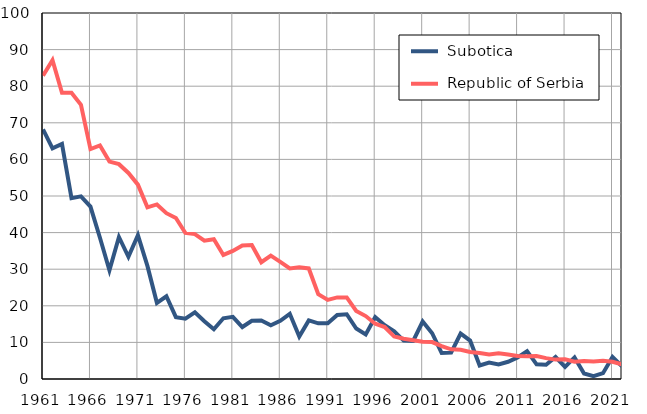
| Category |  Subotica |  Republic of Serbia |
|---|---|---|
| 1961.0 | 68.2 | 82.9 |
| 1962.0 | 63 | 87.1 |
| 1963.0 | 64.2 | 78.2 |
| 1964.0 | 49.4 | 78.2 |
| 1965.0 | 49.9 | 74.9 |
| 1966.0 | 47.1 | 62.8 |
| 1967.0 | 38.6 | 63.8 |
| 1968.0 | 29.7 | 59.4 |
| 1969.0 | 38.8 | 58.7 |
| 1970.0 | 33.4 | 56.3 |
| 1971.0 | 39.3 | 53.1 |
| 1972.0 | 30.9 | 46.9 |
| 1973.0 | 20.8 | 47.7 |
| 1974.0 | 22.6 | 45.3 |
| 1975.0 | 16.9 | 44 |
| 1976.0 | 16.5 | 39.9 |
| 1977.0 | 18.2 | 39.6 |
| 1978.0 | 15.8 | 37.8 |
| 1979.0 | 13.6 | 38.2 |
| 1980.0 | 16.6 | 33.9 |
| 1981.0 | 17 | 35 |
| 1982.0 | 14.2 | 36.5 |
| 1983.0 | 15.9 | 36.6 |
| 1984.0 | 16 | 31.9 |
| 1985.0 | 14.7 | 33.7 |
| 1986.0 | 15.9 | 32 |
| 1987.0 | 17.8 | 30.2 |
| 1988.0 | 11.6 | 30.5 |
| 1989.0 | 16 | 30.2 |
| 1990.0 | 15.2 | 23.2 |
| 1991.0 | 15.2 | 21.6 |
| 1992.0 | 17.5 | 22.3 |
| 1993.0 | 17.7 | 22.3 |
| 1994.0 | 13.8 | 18.6 |
| 1995.0 | 12.2 | 17.2 |
| 1996.0 | 16.9 | 15.1 |
| 1997.0 | 14.7 | 14.2 |
| 1998.0 | 13 | 11.6 |
| 1999.0 | 10.5 | 11 |
| 2000.0 | 10.4 | 10.6 |
| 2001.0 | 15.7 | 10.2 |
| 2002.0 | 12.5 | 10.1 |
| 2003.0 | 7.1 | 9 |
| 2004.0 | 7.2 | 8.1 |
| 2005.0 | 12.4 | 8 |
| 2006.0 | 10.5 | 7.4 |
| 2007.0 | 3.7 | 7.1 |
| 2008.0 | 4.5 | 6.7 |
| 2009.0 | 4 | 7 |
| 2010.0 | 4.7 | 6.7 |
| 2011.0 | 5.9 | 6.3 |
| 2012.0 | 7.6 | 6.2 |
| 2013.0 | 4 | 6.3 |
| 2014.0 | 3.9 | 5.7 |
| 2015.0 | 6 | 5.3 |
| 2016.0 | 3.3 | 5.4 |
| 2017.0 | 5.9 | 4.7 |
| 2018.0 | 1.5 | 4.9 |
| 2019.0 | 0.8 | 4.8 |
| 2020.0 | 1.6 | 5 |
| 2021.0 | 6 | 4.7 |
| 2022.0 | 3.5 | 4 |